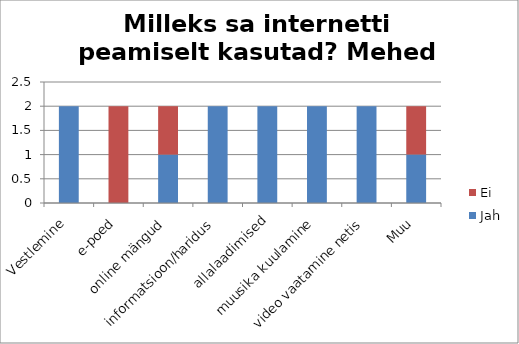
| Category | Jah | Ei |
|---|---|---|
| Vestlemine | 2 | 0 |
| e-poed | 0 | 2 |
| online mängud | 1 | 1 |
| informatsioon/haridus | 2 | 0 |
| allalaadimised | 2 | 0 |
| muusika kuulamine | 2 | 0 |
| video vaatamine netis | 2 | 0 |
| Muu | 1 | 1 |